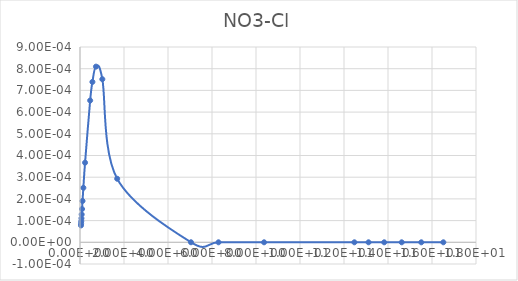
| Category | Series 0 |
|---|---|
| 0.045801 | 0 |
| 0.050889 | 0 |
| 0.057263 | 0 |
| 0.065462 | 0 |
| 0.076377 | 0 |
| 0.091694 | 0 |
| 0.11465 | 0 |
| 0.15301 | 0 |
| 0.22977 | 0 |
| 0.46188 | 0.001 |
| 0.56443 | 0.001 |
| 0.7255 | 0.001 |
| 1.0152 | 0.001 |
| 1.6902 | 0 |
| 5.0451 | 0 |
| 6.2946 | 0 |
| 8.3668 | 0 |
| 12.472 | 0 |
| 13.115 | 0 |
| 13.828 | 0 |
| 14.623 | 0 |
| 15.513 | 0 |
| 16.516 | 0 |